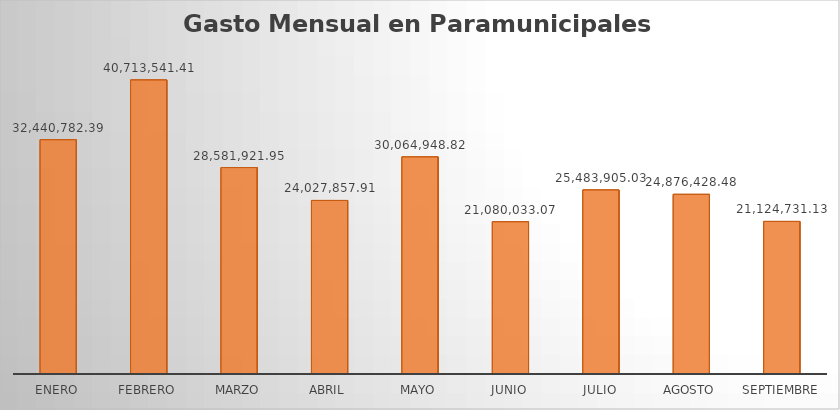
| Category | Monto |
|---|---|
| ENERO | 32440782.39 |
| FEBRERO | 40713541.41 |
| MARZO | 28581921.95 |
| ABRIL | 24027857.91 |
| MAYO | 30064948.82 |
| JUNIO | 21080033.07 |
| JULIO | 25483905.03 |
| AGOSTO | 24876428.48 |
| SEPTIEMBRE | 21124731.13 |